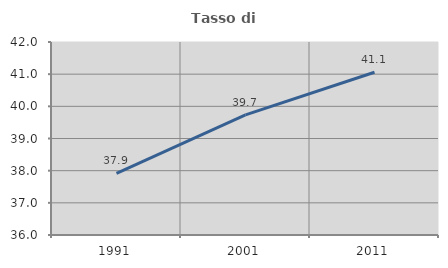
| Category | Tasso di occupazione   |
|---|---|
| 1991.0 | 37.915 |
| 2001.0 | 39.732 |
| 2011.0 | 41.06 |